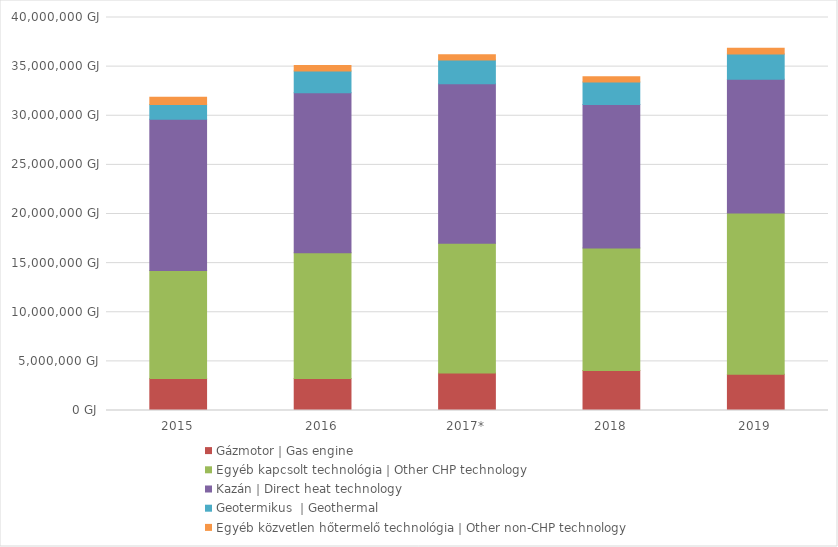
| Category | Gázmotor | Gas engine | Egyéb kapcsolt technológia | Other CHP technology | Kazán | Direct heat technology | Geotermikus  | Geothermal | Egyéb közvetlen hőtermelő technológia | Other non-CHP technology |
|---|---|---|---|---|---|
| 2015 | 3261700.358 | 10993141.817 | 15385089.767 | 1510190.428 | 734235.102 |
| 2016 | 3266806.644 | 12778586.614 | 16286238.449 | 2215272.639 | 570133.157 |
| 2017* | 3821618.528 | 13206231.629 | 16227720.691 | 2414236.782 | 538033.24 |
| 2018 | 4075511.435 | 12457836.638 | 14609391.263 | 2292345.125 | 534292.729 |
| 2019 | 3701329.37 | 16389708.861 | 13623730.602 | 2565680.172 | 580592.237 |